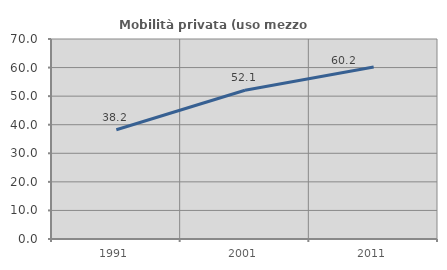
| Category | Mobilità privata (uso mezzo privato) |
|---|---|
| 1991.0 | 38.22 |
| 2001.0 | 52.079 |
| 2011.0 | 60.169 |